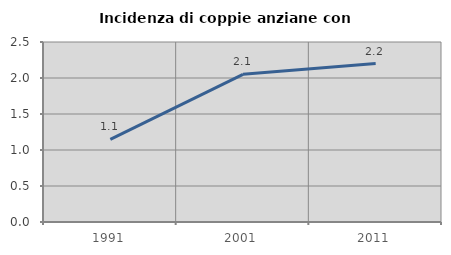
| Category | Incidenza di coppie anziane con figli |
|---|---|
| 1991.0 | 1.146 |
| 2001.0 | 2.051 |
| 2011.0 | 2.201 |